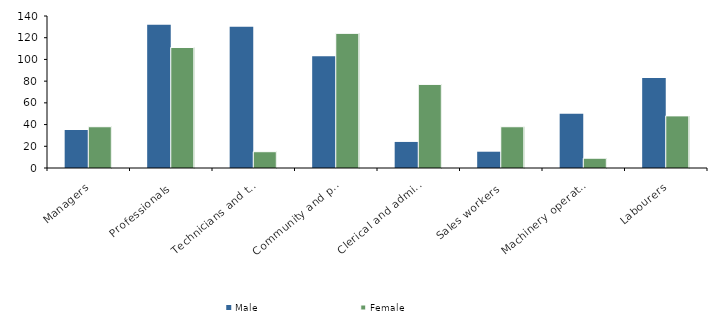
| Category | Male | Female |
|---|---|---|
| Managers | 35 | 38 |
| Professionals | 132 | 111 |
| Technicians and trades workers | 130 | 15 |
| Community and personal service workers | 103 | 124 |
| Clerical and administrative workers | 24 | 77 |
| Sales workers | 15 | 38 |
| Machinery operators and drivers | 50 | 9 |
| Labourers | 83 | 48 |